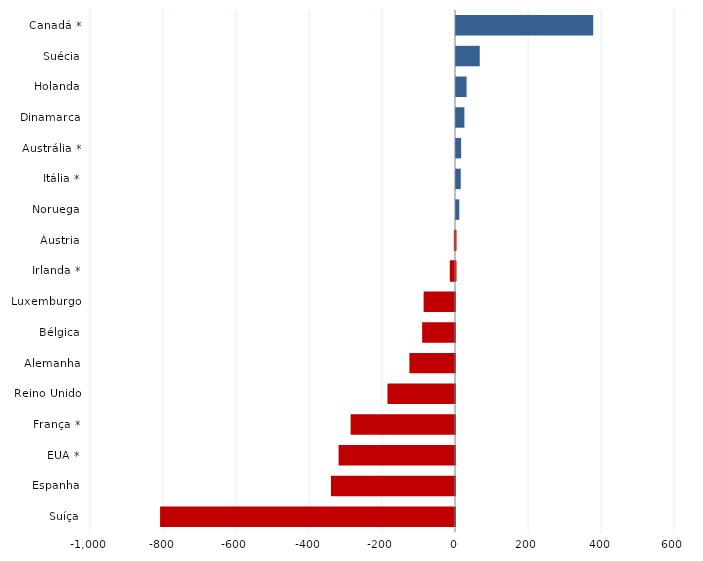
| Category | Series 0 |
|---|---|
| Suíça | -808 |
| Espanha | -340 |
| EUA * | -319 |
| França * | -286 |
| Reino Unido | -185 |
| Alemanha | -125 |
| Bélgica | -90 |
| Luxemburgo | -86 |
| Irlanda * | -14 |
| Áustria | -3 |
| Noruega | 9 |
| Itália * | 13 |
| Austrália * | 14 |
| Dinamarca | 23 |
| Holanda | 29 |
| Suécia | 65 |
| Canadá * | 376 |